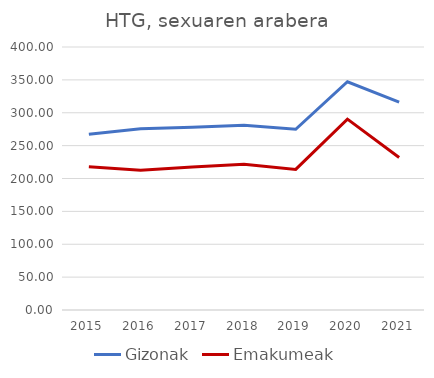
| Category | Gizonak | Emakumeak |
|---|---|---|
| 2015.0 | 267.447 | 217.888 |
| 2016.0 | 275.796 | 212.644 |
| 2017.0 | 278.065 | 217.374 |
| 2018.0 | 281.155 | 221.674 |
| 2019.0 | 274.839 | 213.818 |
| 2020.0 | 347.169 | 290.26 |
| 2021.0 | 316.058 | 231.938 |